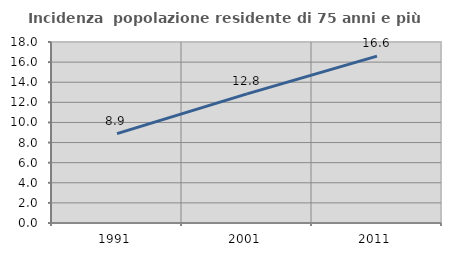
| Category | Incidenza  popolazione residente di 75 anni e più |
|---|---|
| 1991.0 | 8.891 |
| 2001.0 | 12.837 |
| 2011.0 | 16.593 |